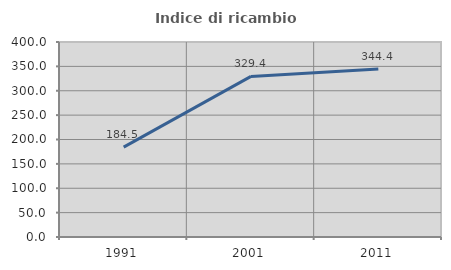
| Category | Indice di ricambio occupazionale  |
|---|---|
| 1991.0 | 184.483 |
| 2001.0 | 329.412 |
| 2011.0 | 344.444 |